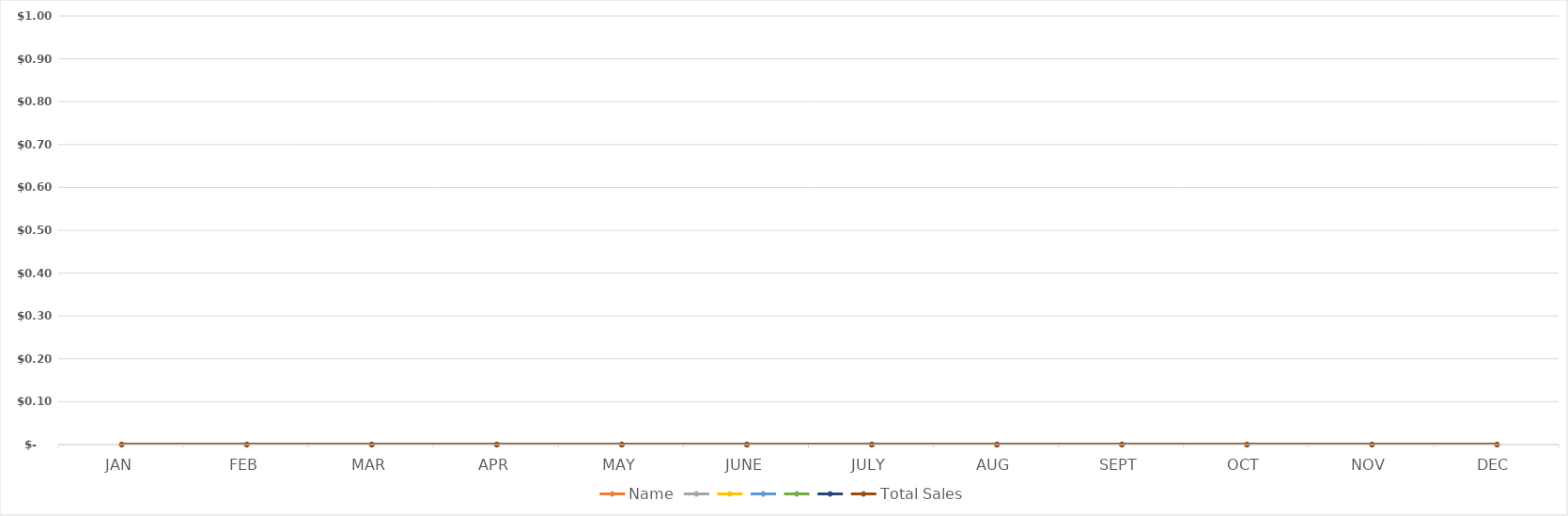
| Category | Name | Series 2 | Series 3 | Series 4 | Series 5 | Series 6 | Total Sales |
|---|---|---|---|---|---|---|---|
| JAN | 0 | 0 | 0 | 0 | 0 | 0 | 0 |
| FEB | 0 | 0 | 0 | 0 | 0 | 0 | 0 |
| MAR | 0 | 0 | 0 | 0 | 0 | 0 | 0 |
| APR | 0 | 0 | 0 | 0 | 0 | 0 | 0 |
| MAY | 0 | 0 | 0 | 0 | 0 | 0 | 0 |
| JUNE | 0 | 0 | 0 | 0 | 0 | 0 | 0 |
| JULY | 0 | 0 | 0 | 0 | 0 | 0 | 0 |
| AUG | 0 | 0 | 0 | 0 | 0 | 0 | 0 |
| SEPT | 0 | 0 | 0 | 0 | 0 | 0 | 0 |
| OCT | 0 | 0 | 0 | 0 | 0 | 0 | 0 |
| NOV | 0 | 0 | 0 | 0 | 0 | 0 | 0 |
| DEC | 0 | 0 | 0 | 0 | 0 | 0 | 0 |